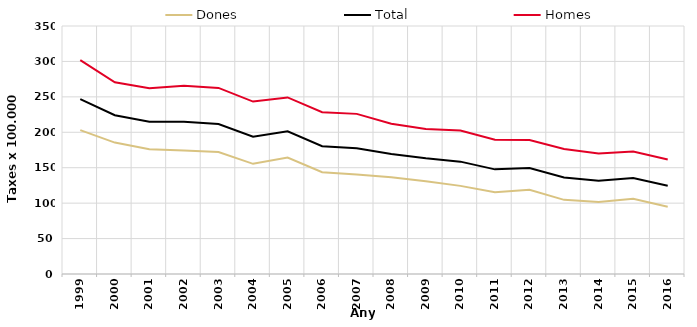
| Category | Dones | Total | Homes |
|---|---|---|---|
| 1999.0 | 203.03 | 246.87 | 301.79 |
| 2000.0 | 185.44 | 224.1 | 270.53 |
| 2001.0 | 176.21 | 214.73 | 262.1 |
| 2002.0 | 174.36 | 214.78 | 265.8 |
| 2003.0 | 172.25 | 211.7 | 262.58 |
| 2004.0 | 155.47 | 193.88 | 243.32 |
| 2005.0 | 164.31 | 201.46 | 249.2 |
| 2006.0 | 143.56 | 180.4 | 228.37 |
| 2007.0 | 140.44 | 177.44 | 225.99 |
| 2008.0 | 136.39 | 169.33 | 212.11 |
| 2009.0 | 130.88 | 163.37 | 204.48 |
| 2010.0 | 124.36 | 158.56 | 202.43 |
| 2011.0 | 115.47 | 147.67 | 189.57 |
| 2012.0 | 118.77 | 149.47 | 189.07 |
| 2013.0 | 104.62 | 136.33 | 176.38 |
| 2014.0 | 101.49 | 131.47 | 170.15 |
| 2015.0 | 106.07 | 135.52 | 172.71 |
| 2016.0 | 94.89 | 124.61 | 161.7 |